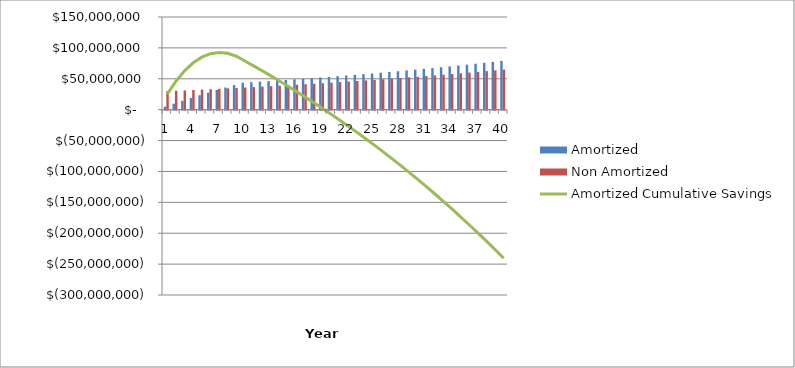
| Category | Amortized | Non Amortized |
|---|---|---|
| 0 | 4890000 | 30000000 |
| 1 | 9667800 | 30600000 |
| 2 | 14331156 | 31212000 |
| 3 | 18877779.12 | 31836240 |
| 4 | 23305334.702 | 32472964.8 |
| 5 | 27611441.396 | 33122424.096 |
| 6 | 31793670.224 | 33784872.578 |
| 7 | 35849543.629 | 34460570.029 |
| 8 | 39776534.501 | 35149781.43 |
| 9 | 43572065.191 | 35852777.059 |
| 10 | 44443506.495 | 36569832.6 |
| 11 | 45332376.625 | 37301229.252 |
| 12 | 46239024.158 | 38047253.837 |
| 13 | 47163804.641 | 38808198.914 |
| 14 | 48107080.734 | 39584362.892 |
| 15 | 49069222.348 | 40376050.15 |
| 16 | 50050606.795 | 41183571.153 |
| 17 | 51051618.931 | 42007242.576 |
| 18 | 52072651.31 | 42847387.427 |
| 19 | 53114104.336 | 43704335.176 |
| 20 | 54176386.423 | 44578421.879 |
| 21 | 55259914.151 | 45469990.317 |
| 22 | 56365112.434 | 46379390.123 |
| 23 | 57492414.683 | 47306977.926 |
| 24 | 58642262.977 | 48253117.484 |
| 25 | 59815108.236 | 49218179.834 |
| 26 | 61011410.401 | 50202543.431 |
| 27 | 62231638.609 | 51206594.299 |
| 28 | 63476271.381 | 52230726.185 |
| 29 | 64745796.809 | 53275340.709 |
| 30 | 66040712.745 | 54340847.523 |
| 31 | 67361527 | 55427664.474 |
| 32 | 68708757.54 | 56536217.763 |
| 33 | 70082932.691 | 57666942.118 |
| 34 | 71484591.344 | 58820280.961 |
| 35 | 72914283.171 | 59996686.58 |
| 36 | 74372568.835 | 61196620.311 |
| 37 | 75860020.211 | 62420552.718 |
| 38 | 77377220.616 | 63668963.772 |
| 39 | 78924765.028 | 64942343.047 |